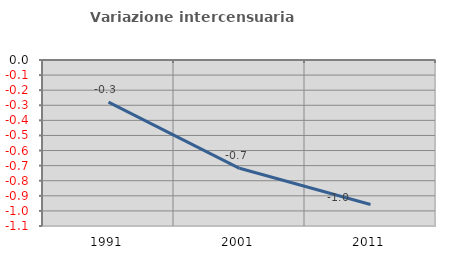
| Category | Variazione intercensuaria annua |
|---|---|
| 1991.0 | -0.279 |
| 2001.0 | -0.718 |
| 2011.0 | -0.957 |